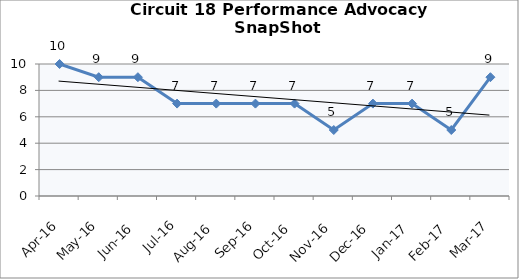
| Category | Circuit 18 |
|---|---|
| Apr-16 | 10 |
| May-16 | 9 |
| Jun-16 | 9 |
| Jul-16 | 7 |
| Aug-16 | 7 |
| Sep-16 | 7 |
| Oct-16 | 7 |
| Nov-16 | 5 |
| Dec-16 | 7 |
| Jan-17 | 7 |
| Feb-17 | 5 |
| Mar-17 | 9 |